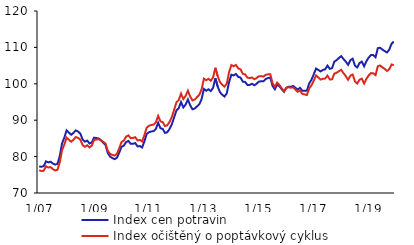
| Category | Index cen potravin | Index očištěný o poptávkový cyklus |
|---|---|---|
|  1/07 | 77.3 | 76.237 |
| 2 | 77.2 | 76.023 |
| 3 | 77.4 | 76.141 |
| 4 | 78.7 | 77.344 |
| 5 | 78.4 | 76.988 |
| 6 | 78.6 | 77.125 |
| 7 | 78.1 | 76.563 |
| 8 | 77.8 | 76.208 |
| 9 | 78 | 76.371 |
| 10 | 80.1 | 78.37 |
| 11 | 83.6 | 81.759 |
| 12 | 85.2 | 83.306 |
|  1/08 | 87.2 | 85.216 |
| 2 | 86.6 | 84.638 |
| 3 | 86 | 84.095 |
| 4 | 86.5 | 84.632 |
| 5 | 87.2 | 85.381 |
| 6 | 86.9 | 85.152 |
| 7 | 86.3 | 84.658 |
| 8 | 84.7 | 83.169 |
| 9 | 84.1 | 82.688 |
| 10 | 84.4 | 83.122 |
| 11 | 83.6 | 82.518 |
| 12 | 83.9 | 83.019 |
|  1/09 | 85.2 | 84.559 |
| 2 | 85.1 | 84.69 |
| 3 | 85 | 84.777 |
| 4 | 84.5 | 84.458 |
| 5 | 83.8 | 84.049 |
| 6 | 83.2 | 83.609 |
| 7 | 81 | 81.598 |
| 8 | 80 | 80.75 |
| 9 | 79.6 | 80.475 |
| 10 | 79.3 | 80.269 |
| 11 | 79.7 | 80.781 |
| 12 | 81.1 | 82.297 |
|  1/10 | 82.7 | 84.018 |
| 2 | 83 | 84.406 |
| 3 | 84 | 85.491 |
| 4 | 84.3 | 85.834 |
| 5 | 83.5 | 85.067 |
| 6 | 83.5 | 85.115 |
| 7 | 83.7 | 85.326 |
| 8 | 82.8 | 84.437 |
| 9 | 82.9 | 84.571 |
| 10 | 82.5 | 84.167 |
| 11 | 84.2 | 85.917 |
| 12 | 86.2 | 87.959 |
|  1/11 | 86.7 | 88.47 |
| 2 | 86.9 | 88.689 |
| 3 | 87 | 88.793 |
| 4 | 87.6 | 89.405 |
| 5 | 89.3 | 91.171 |
| 6 | 87.8 | 89.674 |
| 7 | 87.6 | 89.489 |
| 8 | 86.5 | 88.397 |
| 9 | 86.7 | 88.606 |
| 10 | 87.6 | 89.556 |
| 11 | 88.9 | 90.919 |
| 12 | 90.8 | 92.898 |
|  1/12 | 92.7 | 94.895 |
| 2 | 93.3 | 95.548 |
| 3 | 95 | 97.31 |
| 4 | 93.5 | 95.809 |
| 5 | 94.3 | 96.665 |
| 6 | 95.7 | 98.105 |
| 7 | 94.1 | 96.514 |
| 8 | 93 | 95.424 |
| 9 | 93.2 | 95.682 |
| 10 | 93.8 | 96.354 |
| 11 | 94.4 | 96.993 |
| 12 | 95.8 | 98.485 |
|  1/13 | 98.6 | 101.421 |
| 2 | 98.1 | 100.982 |
| 3 | 98.5 | 101.369 |
| 4 | 98 | 100.835 |
| 5 | 98.9 | 101.741 |
| 6 | 101.5 | 104.395 |
| 7 | 99.3 | 102.147 |
| 8 | 97.7 | 100.486 |
| 9 | 97 | 99.748 |
| 10 | 96.5 | 99.215 |
| 11 | 97.4 | 100.087 |
| 12 | 100.5 | 103.196 |
|  1/14 | 102.5 | 105.152 |
| 2 | 102.3 | 104.828 |
| 3 | 102.7 | 105.17 |
| 4 | 101.9 | 104.272 |
| 5 | 101.7 | 103.97 |
| 6 | 100.6 | 102.764 |
| 7 | 100.5 | 102.583 |
| 8 | 99.7 | 101.688 |
| 9 | 99.7 | 101.575 |
| 10 | 100 | 101.747 |
| 11 | 99.6 | 101.255 |
| 12 | 100 | 101.583 |
|  1/15 | 100.6 | 102.096 |
| 2 | 100.7 | 102.1 |
| 3 | 100.7 | 101.984 |
| 4 | 101.3 | 102.457 |
| 5 | 101.6 | 102.605 |
| 6 | 101.7 | 102.6 |
| 7 | 99.4 | 100.165 |
| 8 | 98.5 | 99.144 |
| 9 | 99.8 | 100.337 |
| 10 | 99.3 | 99.669 |
| 11 | 98.5 | 98.745 |
| 12 | 97.8 | 97.946 |
|  1/16 | 98.9 | 98.902 |
| 2 | 99.2 | 99.051 |
| 3 | 99.2 | 98.931 |
| 4 | 99.4 | 98.999 |
| 5 | 98.9 | 98.402 |
| 6 | 98.4 | 97.793 |
| 7 | 98.9 | 98.16 |
| 8 | 98.1 | 97.236 |
| 9 | 98.1 | 97.072 |
| 10 | 98.1 | 96.921 |
| 11 | 100.1 | 98.728 |
| 12 | 101.1 | 99.559 |
|  1/17 | 102.6 | 100.88 |
| 2 | 104.2 | 102.296 |
| 3 | 103.8 | 101.746 |
| 4 | 103.4 | 101.164 |
| 5 | 103.8 | 101.378 |
| 6 | 104 | 101.431 |
| 7 | 105 | 102.251 |
| 8 | 104.1 | 101.202 |
| 9 | 104.3 | 101.221 |
| 10 | 106.1 | 102.807 |
| 11 | 106.5 | 103.035 |
| 12 | 107.1 | 103.474 |
|  1/18 | 107.6 | 103.834 |
| 2 | 106.8 | 102.925 |
| 3 | 106.1 | 102.114 |
| 4 | 105.2 | 101.111 |
| 5 | 106.5 | 102.223 |
| 6 | 106.9 | 102.538 |
| 7 | 105 | 100.655 |
| 8 | 104.5 | 100.068 |
| 9 | 105.7 | 101.118 |
| 10 | 106.1 | 101.403 |
| 11 | 104.8 | 100.081 |
| 12 | 106.2 | 101.374 |
|  1/19 | 107.2 | 102.305 |
| 2 | 107.9 | 102.936 |
| 3 | 107.9 | 102.914 |
| 4 | 107.3 | 102.39 |
| 5 | 109.8 | 104.835 |
| 6 | 109.9 | 105.026 |
| 7 | 109.4 | 104.507 |
| 8 | 109 | 104.121 |
| 9 | 108.6 | 103.502 |
| 10 | 109.4 | 104.026 |
| 11 | 111 | 105.306 |
| 12 | 111.6 | 105.106 |